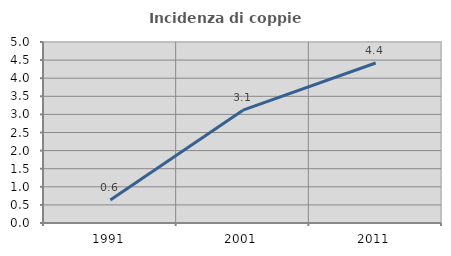
| Category | Incidenza di coppie miste |
|---|---|
| 1991.0 | 0.636 |
| 2001.0 | 3.116 |
| 2011.0 | 4.419 |